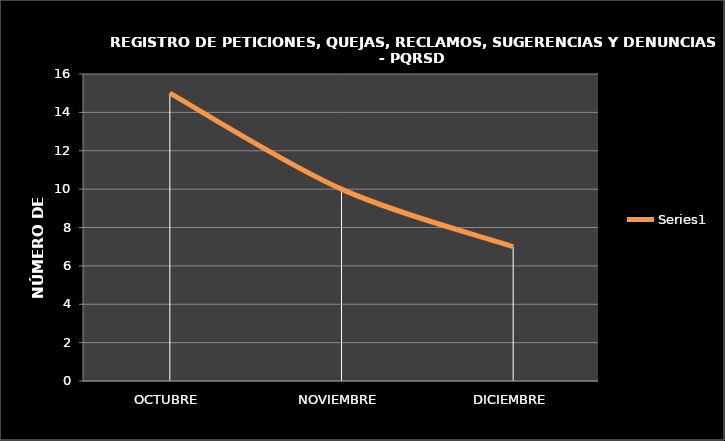
| Category | Series 0 |
|---|---|
| OCTUBRE | 15 |
| NOVIEMBRE | 10 |
| DICIEMBRE | 7 |